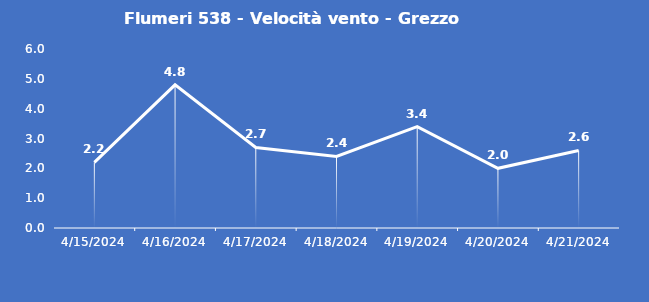
| Category | Flumeri 538 - Velocità vento - Grezzo (m/s) |
|---|---|
| 4/15/24 | 2.2 |
| 4/16/24 | 4.8 |
| 4/17/24 | 2.7 |
| 4/18/24 | 2.4 |
| 4/19/24 | 3.4 |
| 4/20/24 | 2 |
| 4/21/24 | 2.6 |